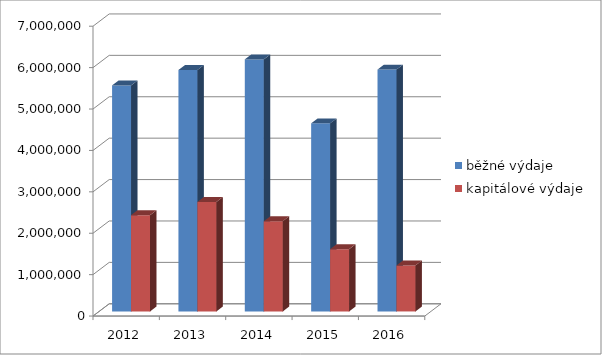
| Category | běžné výdaje | kapitálové výdaje |
|---|---|---|
| 2012.0 | 5459295 | 2326441 |
| 2013.0 | 5831442 | 2645599 |
| 2014.0 | 6088027 | 2178472 |
| 2015.0 | 4542841 | 1505307 |
| 2016.0 | 5842509 | 1110863 |